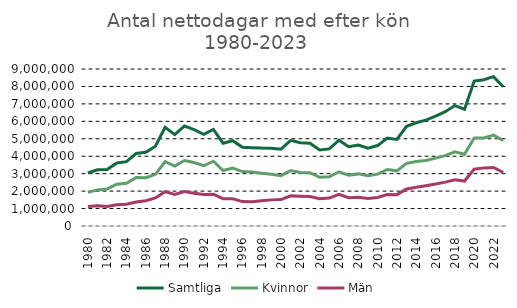
| Category | Samtliga | Kvinnor | Män |
|---|---|---|---|
| 1980.0 | 3042068 | 1928671.112 | 1113396.888 |
| 1981.0 | 3223428 | 2069440.776 | 1153987.224 |
| 1982.0 | 3235914 | 2122759.584 | 1113154.416 |
| 1983.0 | 3609607 | 2393169.441 | 1216437.559 |
| 1984.0 | 3689387 | 2446063.581 | 1243323.419 |
| 1985.0 | 4156207 | 2780502.483 | 1375704.517 |
| 1986.0 | 4223484 | 2770605.504 | 1452878.496 |
| 1987.0 | 4571957 | 2962628.136 | 1609328.864 |
| 1988.0 | 5661000 | 3690972 | 1970028 |
| 1989.0 | 5238288 | 3433528 | 1804760 |
| 1990.0 | 5730592 | 3755660 | 1974932 |
| 1991.0 | 5524488 | 3641597 | 1882892 |
| 1992.0 | 5259499 | 3454071 | 1805429 |
| 1993.0 | 5541238 | 3715702 | 1825536 |
| 1994.0 | 4744423 | 3180854 | 1563569 |
| 1995.0 | 4890167 | 3325023 | 1565144 |
| 1996.0 | 4515745 | 3117461 | 1398285 |
| 1997.0 | 4489391 | 3096279 | 1393112 |
| 1998.0 | 4467931 | 3023516 | 1444415 |
| 1999.0 | 4460599 | 2962931 | 1497668 |
| 2000.0 | 4403232 | 2888059 | 1515172 |
| 2001.0 | 4907670 | 3180863 | 1726807 |
| 2002.0 | 4776490 | 3071677 | 1704814 |
| 2003.0 | 4746646 | 3055349 | 1691297 |
| 2004.0 | 4354448 | 2793796 | 1560653 |
| 2005.0 | 4421332 | 2819216 | 1602116 |
| 2006.0 | 4920095 | 3107333 | 1812762 |
| 2007.0 | 4542250 | 2917678 | 1624572 |
| 2008.0 | 4637528 | 2987269 | 1650259 |
| 2009.0 | 4461107 | 2878590 | 1582517 |
| 2010.0 | 4610616 | 2972340 | 1638276 |
| 2011.0 | 5043838 | 3238400 | 1805438 |
| 2012.0 | 4959238 | 3162339 | 1796899 |
| 2013.0 | 5718440 | 3593511 | 2124929 |
| 2014.0 | 5920029 | 3702292 | 2217737 |
| 2015.0 | 6069363 | 3758944 | 2310419 |
| 2016.0 | 6300720 | 3889853 | 2410867 |
| 2017.0 | 6551491 | 4035163 | 2516328 |
| 2018.0 | 6904412 | 4250194 | 2654218 |
| 2019.0 | 6694134 | 4116714 | 2577420 |
| 2020.0 | 8309870 | 5050783 | 3259087 |
| 2021.0 | 8381430 | 5049846 | 3331584 |
| 2022.0 | 8563171 | 5211071 | 3352100 |
| 2023.0 | 7977317 | 4901803 | 3075514 |